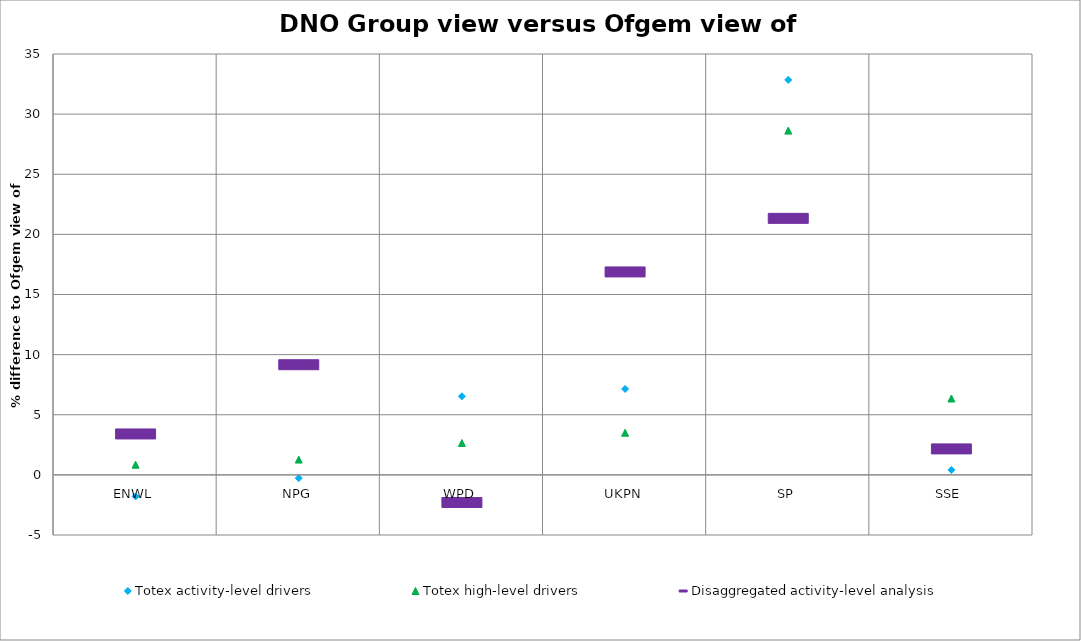
| Category | Totex activity-level drivers | Totex high-level drivers | Disaggregated activity-level analysis |
|---|---|---|---|
| ENWL | -1.792 | 0.845 | 3.404 |
| NPG | -0.272 | 1.273 | 9.16 |
| WPD | 6.536 | 2.65 | -2.296 |
| UKPN | 7.145 | 3.504 | 16.877 |
| SP | 32.847 | 28.632 | 21.331 |
| SSE | 0.411 | 6.353 | 2.16 |